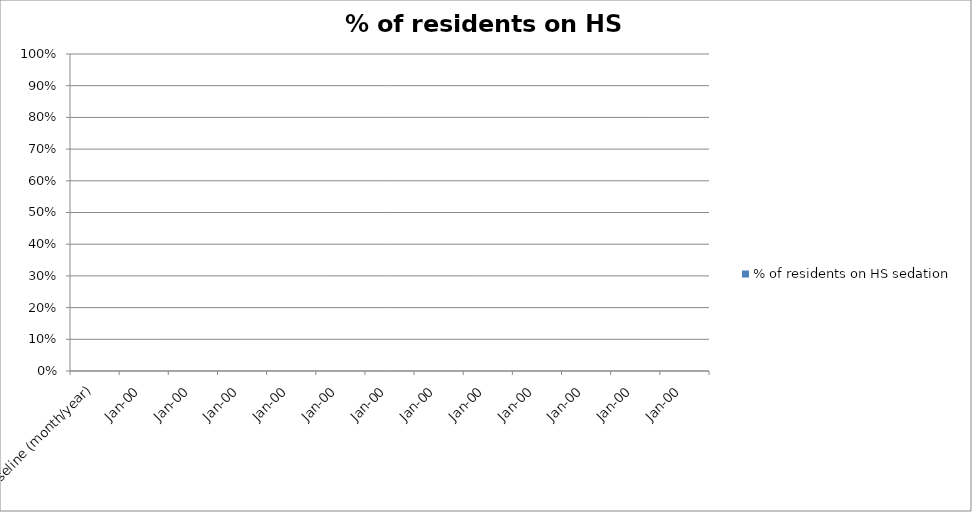
| Category | % of residents on HS sedation |
|---|---|
| Baseline (month/year) | 0 |
| Jan-00 | 0 |
| Jan-00 | 0 |
| Jan-00 | 0 |
| Jan-00 | 0 |
| Jan-00 | 0 |
| Jan-00 | 0 |
| Jan-00 | 0 |
| Jan-00 | 0 |
| Jan-00 | 0 |
| Jan-00 | 0 |
| Jan-00 | 0 |
| Jan-00 | 0 |